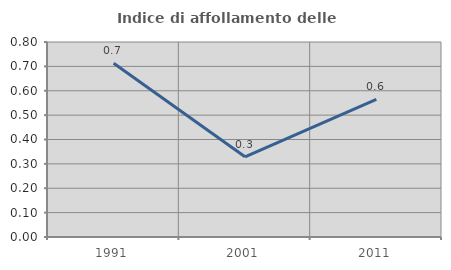
| Category | Indice di affollamento delle abitazioni  |
|---|---|
| 1991.0 | 0.713 |
| 2001.0 | 0.329 |
| 2011.0 | 0.564 |